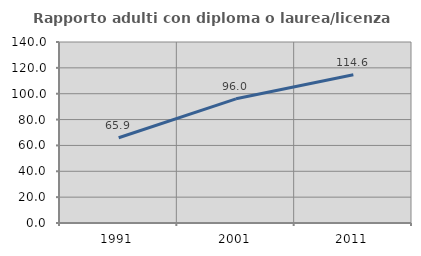
| Category | Rapporto adulti con diploma o laurea/licenza media  |
|---|---|
| 1991.0 | 65.926 |
| 2001.0 | 96.045 |
| 2011.0 | 114.634 |